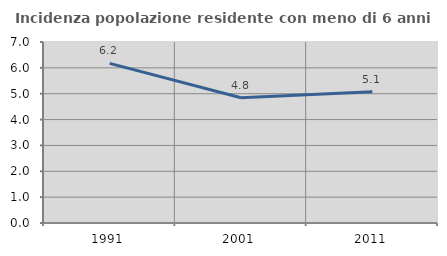
| Category | Incidenza popolazione residente con meno di 6 anni |
|---|---|
| 1991.0 | 6.174 |
| 2001.0 | 4.846 |
| 2011.0 | 5.076 |